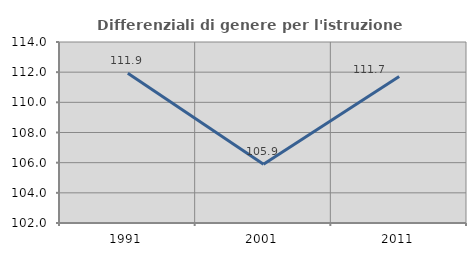
| Category | Differenziali di genere per l'istruzione superiore |
|---|---|
| 1991.0 | 111.93 |
| 2001.0 | 105.895 |
| 2011.0 | 111.719 |